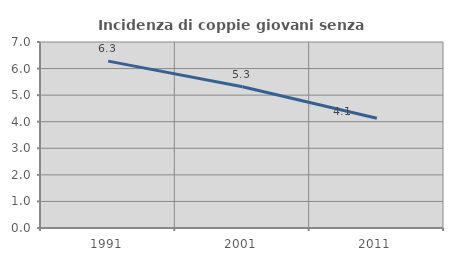
| Category | Incidenza di coppie giovani senza figli |
|---|---|
| 1991.0 | 6.28 |
| 2001.0 | 5.314 |
| 2011.0 | 4.128 |